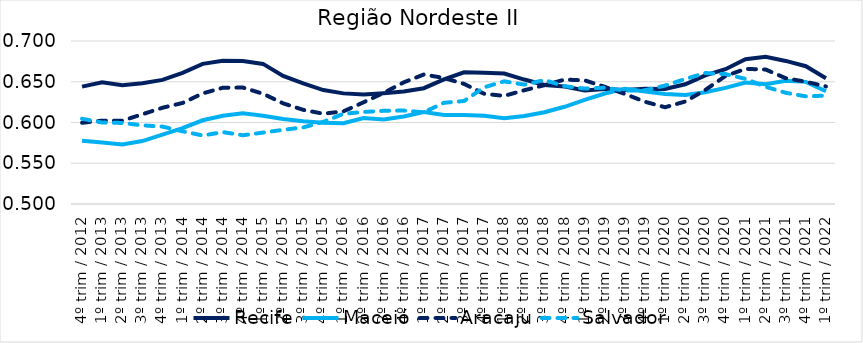
| Category | Recife | Maceió | Aracaju | Salvador |
|---|---|---|---|---|
| 4º trim / 2012 | 0.644 | 0.578 | 0.6 | 0.605 |
| 1º trim / 2013 | 0.649 | 0.575 | 0.602 | 0.6 |
| 2º trim / 2013 | 0.646 | 0.573 | 0.602 | 0.599 |
| 3º trim / 2013 | 0.648 | 0.577 | 0.61 | 0.597 |
| 4º trim / 2013 | 0.652 | 0.585 | 0.618 | 0.595 |
| 1º trim / 2014 | 0.661 | 0.593 | 0.624 | 0.589 |
| 2º trim / 2014 | 0.672 | 0.603 | 0.636 | 0.584 |
| 3º trim / 2014 | 0.676 | 0.608 | 0.643 | 0.588 |
| 4º trim / 2014 | 0.676 | 0.611 | 0.643 | 0.584 |
| 1º trim / 2015 | 0.672 | 0.608 | 0.635 | 0.588 |
| 2º trim / 2015 | 0.657 | 0.604 | 0.624 | 0.591 |
| 3º trim / 2015 | 0.648 | 0.602 | 0.616 | 0.594 |
| 4º trim / 2015 | 0.64 | 0.6 | 0.611 | 0.601 |
| 1º trim / 2016 | 0.636 | 0.599 | 0.614 | 0.611 |
| 2º trim / 2016 | 0.634 | 0.605 | 0.625 | 0.613 |
| 3º trim / 2016 | 0.636 | 0.604 | 0.636 | 0.614 |
| 4º trim / 2016 | 0.638 | 0.607 | 0.649 | 0.615 |
| 1º trim / 2017 | 0.642 | 0.613 | 0.659 | 0.612 |
| 2º trim / 2017 | 0.653 | 0.609 | 0.655 | 0.624 |
| 3º trim / 2017 | 0.662 | 0.609 | 0.647 | 0.626 |
| 4º trim / 2017 | 0.661 | 0.608 | 0.635 | 0.643 |
| 1º trim / 2018 | 0.66 | 0.605 | 0.633 | 0.651 |
| 2º trim / 2018 | 0.653 | 0.608 | 0.64 | 0.646 |
| 3º trim / 2018 | 0.646 | 0.613 | 0.646 | 0.652 |
| 4º trim / 2018 | 0.644 | 0.619 | 0.653 | 0.645 |
| 1º trim / 2019 | 0.639 | 0.628 | 0.652 | 0.642 |
| 2º trim / 2019 | 0.641 | 0.636 | 0.644 | 0.643 |
| 3º trim / 2019 | 0.64 | 0.641 | 0.635 | 0.639 |
| 4º trim / 2019 | 0.641 | 0.638 | 0.625 | 0.64 |
| 1º trim / 2020 | 0.641 | 0.635 | 0.619 | 0.645 |
| 2º trim / 2020 | 0.647 | 0.634 | 0.626 | 0.653 |
| 3º trim / 2020 | 0.658 | 0.637 | 0.64 | 0.661 |
| 4º trim / 2020 | 0.665 | 0.642 | 0.657 | 0.659 |
| 1º trim / 2021 | 0.678 | 0.649 | 0.666 | 0.654 |
| 2º trim / 2021 | 0.681 | 0.647 | 0.665 | 0.644 |
| 3º trim / 2021 | 0.676 | 0.651 | 0.654 | 0.636 |
| 4º trim / 2021 | 0.669 | 0.65 | 0.65 | 0.632 |
| 1º trim / 2022 | 0.654 | 0.638 | 0.644 | 0.633 |